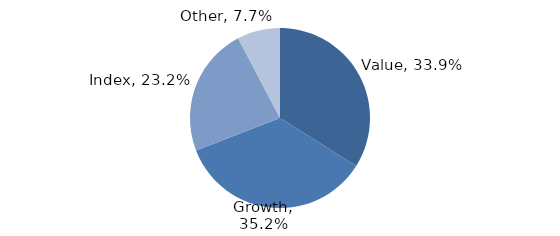
| Category | Investment Style |
|---|---|
| Value | 0.339 |
| Growth | 0.352 |
| Index | 0.232 |
| Other | 0.077 |